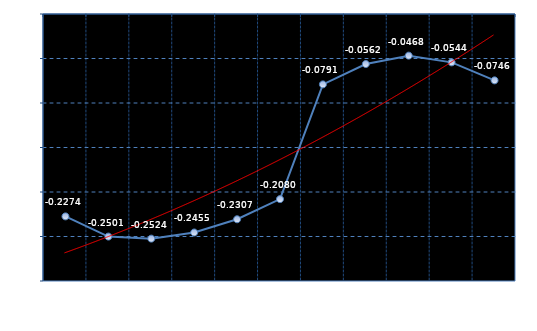
| Category | Series 0 |
|---|---|
| RBES1H | -0.227 |
| RBES2H | -0.25 |
| RBES3H | -0.252 |
| RBES4H | -0.246 |
| RBES5H | -0.231 |
| RBES6H | -0.208 |
| RBES7H | -0.079 |
| RBES8H | -0.056 |
| RBES9H | -0.047 |
| RBES10H | -0.054 |
| RBES11H | -0.075 |